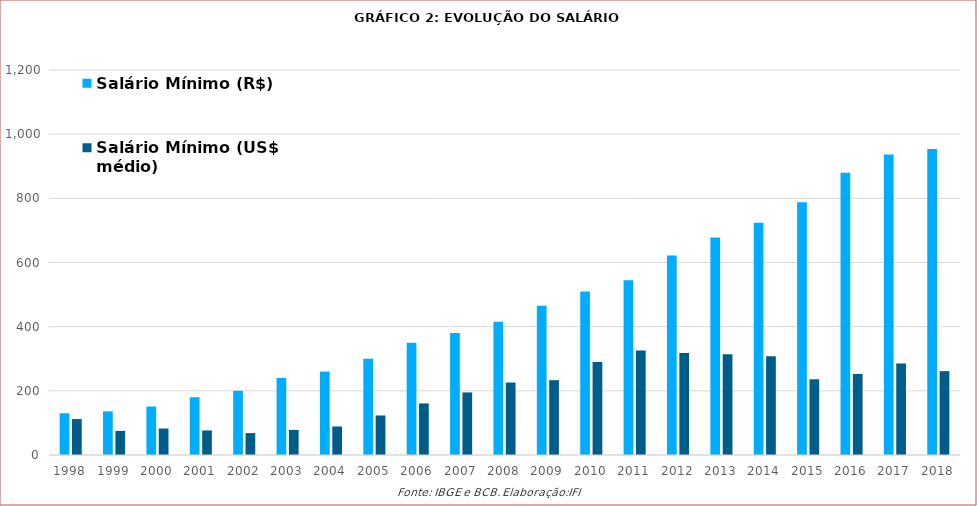
| Category | Salário Mínimo (R$) | Salário Mínimo (US$ médio) |
|---|---|---|
| 1998 | 130 | 112.069 |
| 1999 | 136 | 75.138 |
| 2000 | 151 | 82.536 |
| 2001 | 180 | 76.524 |
| 2002 | 200 | 68.238 |
| 2003 | 240 | 78.138 |
| 2004 | 260 | 88.868 |
| 2005 | 300 | 123.249 |
| 2006 | 350 | 160.764 |
| 2007 | 380 | 195.042 |
| 2008 | 415 | 225.85 |
| 2009 | 465 | 233.258 |
| 2010 | 510 | 289.888 |
| 2011 | 545 | 325.451 |
| 2012 | 622 | 318.159 |
| 2013 | 678 | 313.816 |
| 2014 | 724 | 307.47 |
| 2015 | 788 | 236.02 |
| 2016 | 880 | 252.676 |
| 2017 | 937 | 285.362 |
| 2018 | 954 | 261.37 |